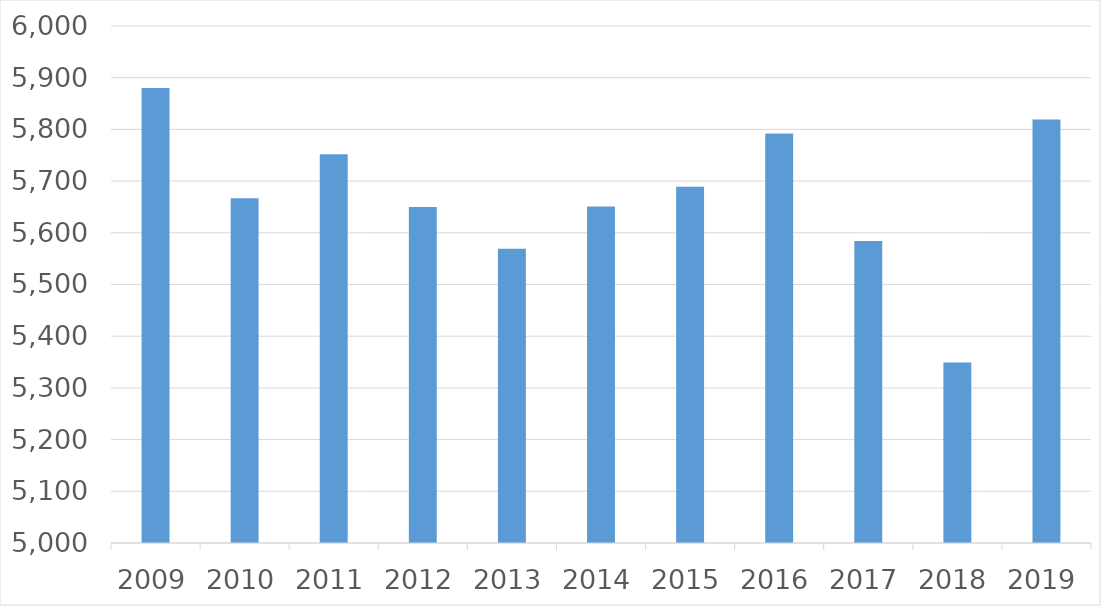
| Category | Series 0 |
|---|---|
| 2009 | 5880 |
| 2010 | 5667 |
| 2011 | 5752 |
| 2012 | 5650 |
| 2013 | 5569 |
| 2014 | 5651 |
| 2015 | 5689 |
| 2016 | 5792 |
| 2017 | 5584 |
| 2018 | 5349 |
| 2019 | 5819 |